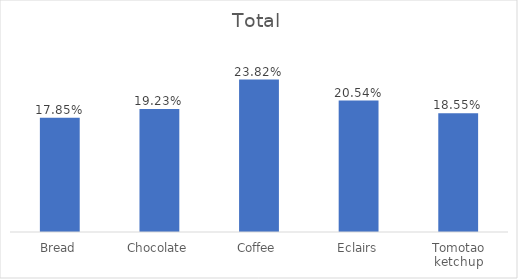
| Category | Total |
|---|---|
| Bread | 0.178 |
| Chocolate | 0.192 |
| Coffee | 0.238 |
| Eclairs | 0.205 |
| Tomotao ketchup | 0.186 |